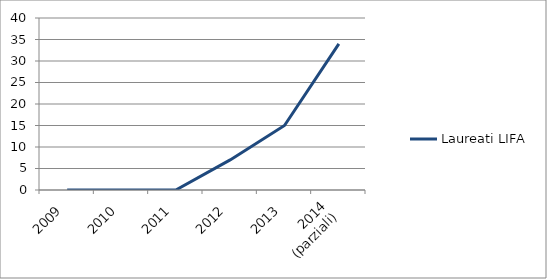
| Category | Laureati LIFA |
|---|---|
| 2009 | 0 |
| 2010 | 0 |
| 2011 | 0 |
| 2012 | 7 |
| 2013 | 15 |
| 2014
(parziali) | 34 |